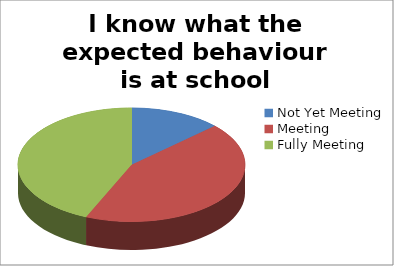
| Category | I know what the expected behaviour is at school |
|---|---|
| Not Yet Meeting | 6 |
| Meeting | 20 |
| Fully Meeting | 20 |